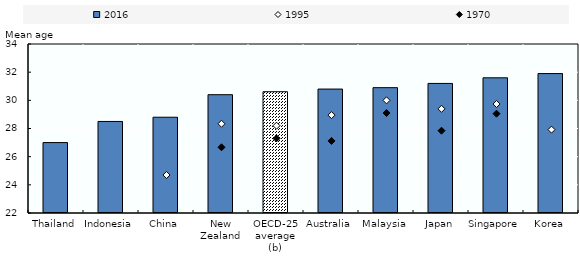
| Category | 2016 |
|---|---|
| Thailand | 27 |
| Indonesia | 28.5 |
| China | 28.8 |
| New Zealand | 30.4 |
| OECD-25 average (b) | 30.612 |
| Australia | 30.8 |
| Malaysia | 30.9 |
| Japan | 31.2 |
| Singapore | 31.6 |
| Korea | 31.9 |